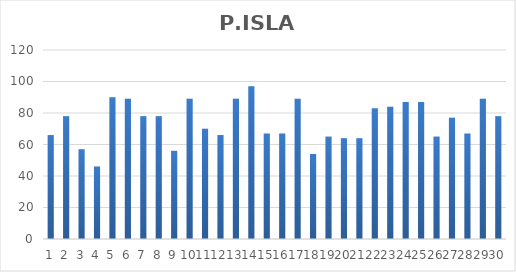
| Category | P.ISLAM |
|---|---|
| 0 | 66 |
| 1 | 78 |
| 2 | 57 |
| 3 | 46 |
| 4 | 90 |
| 5 | 89 |
| 6 | 78 |
| 7 | 78 |
| 8 | 56 |
| 9 | 89 |
| 10 | 70 |
| 11 | 66 |
| 12 | 89 |
| 13 | 97 |
| 14 | 67 |
| 15 | 67 |
| 16 | 89 |
| 17 | 54 |
| 18 | 65 |
| 19 | 64 |
| 20 | 64 |
| 21 | 83 |
| 22 | 84 |
| 23 | 87 |
| 24 | 87 |
| 25 | 65 |
| 26 | 77 |
| 27 | 67 |
| 28 | 89 |
| 29 | 78 |